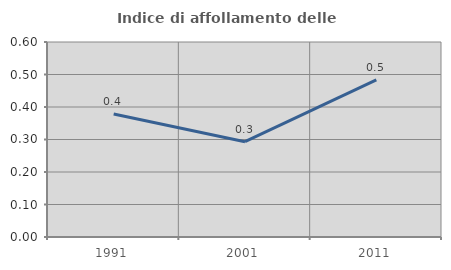
| Category | Indice di affollamento delle abitazioni  |
|---|---|
| 1991.0 | 0.378 |
| 2001.0 | 0.293 |
| 2011.0 | 0.483 |